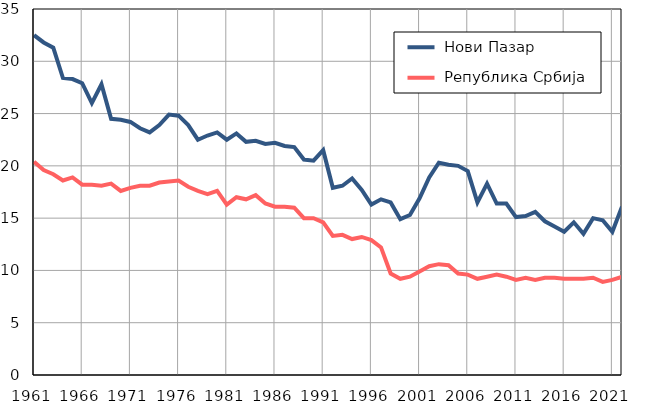
| Category |  Нови Пазар |  Република Србија |
|---|---|---|
| 1961.0 | 32.5 | 20.4 |
| 1962.0 | 31.8 | 19.6 |
| 1963.0 | 31.3 | 19.2 |
| 1964.0 | 28.4 | 18.6 |
| 1965.0 | 28.3 | 18.9 |
| 1966.0 | 27.9 | 18.2 |
| 1967.0 | 26 | 18.2 |
| 1968.0 | 27.8 | 18.1 |
| 1969.0 | 24.5 | 18.3 |
| 1970.0 | 24.4 | 17.6 |
| 1971.0 | 24.2 | 17.9 |
| 1972.0 | 23.6 | 18.1 |
| 1973.0 | 23.2 | 18.1 |
| 1974.0 | 23.9 | 18.4 |
| 1975.0 | 24.9 | 18.5 |
| 1976.0 | 24.8 | 18.6 |
| 1977.0 | 23.9 | 18 |
| 1978.0 | 22.5 | 17.6 |
| 1979.0 | 22.9 | 17.3 |
| 1980.0 | 23.2 | 17.6 |
| 1981.0 | 22.5 | 16.3 |
| 1982.0 | 23.1 | 17 |
| 1983.0 | 22.3 | 16.8 |
| 1984.0 | 22.4 | 17.2 |
| 1985.0 | 22.1 | 16.4 |
| 1986.0 | 22.2 | 16.1 |
| 1987.0 | 21.9 | 16.1 |
| 1988.0 | 21.8 | 16 |
| 1989.0 | 20.6 | 15 |
| 1990.0 | 20.5 | 15 |
| 1991.0 | 21.5 | 14.6 |
| 1992.0 | 17.9 | 13.3 |
| 1993.0 | 18.1 | 13.4 |
| 1994.0 | 18.8 | 13 |
| 1995.0 | 17.7 | 13.2 |
| 1996.0 | 16.3 | 12.9 |
| 1997.0 | 16.8 | 12.2 |
| 1998.0 | 16.5 | 9.7 |
| 1999.0 | 14.9 | 9.2 |
| 2000.0 | 15.3 | 9.4 |
| 2001.0 | 16.9 | 9.9 |
| 2002.0 | 18.9 | 10.4 |
| 2003.0 | 20.3 | 10.6 |
| 2004.0 | 20.1 | 10.5 |
| 2005.0 | 20 | 9.7 |
| 2006.0 | 19.5 | 9.6 |
| 2007.0 | 16.5 | 9.2 |
| 2008.0 | 18.3 | 9.4 |
| 2009.0 | 16.4 | 9.6 |
| 2010.0 | 16.4 | 9.4 |
| 2011.0 | 15.1 | 9.1 |
| 2012.0 | 15.2 | 9.3 |
| 2013.0 | 15.6 | 9.1 |
| 2014.0 | 14.7 | 9.3 |
| 2015.0 | 14.2 | 9.3 |
| 2016.0 | 13.7 | 9.2 |
| 2017.0 | 14.6 | 9.2 |
| 2018.0 | 13.5 | 9.2 |
| 2019.0 | 15 | 9.3 |
| 2020.0 | 14.8 | 8.9 |
| 2021.0 | 13.7 | 9.1 |
| 2022.0 | 16.1 | 9.4 |